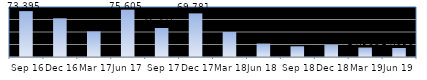
| Category | Series 0 |
|---|---|
| Sep 16 | 73395 |
| Dec 16 | 61941 |
| Mar 17 | 40975 |
| Jun 17 | 75605 |
| Sep 17 | 46415 |
| Dec 17 | 69781 |
| Mar 18 | 39999 |
| Jun 18 | 21354 |
| Sep 18 | 17176 |
| Dec 18 | 19229 |
| Mar 19 | 14968 |
| Jun 19 | 14398 |